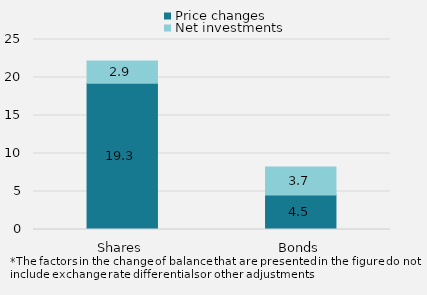
| Category | Price changes | Net investments |
|---|---|---|
| Shares | 19254 | 2913 |
| Bonds | 4544 | 3676 |